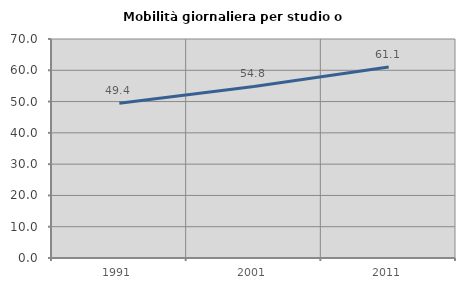
| Category | Mobilità giornaliera per studio o lavoro |
|---|---|
| 1991.0 | 49.441 |
| 2001.0 | 54.845 |
| 2011.0 | 61.052 |